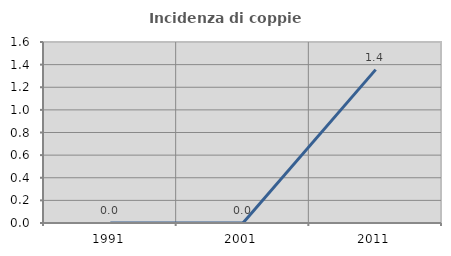
| Category | Incidenza di coppie miste |
|---|---|
| 1991.0 | 0 |
| 2001.0 | 0 |
| 2011.0 | 1.356 |